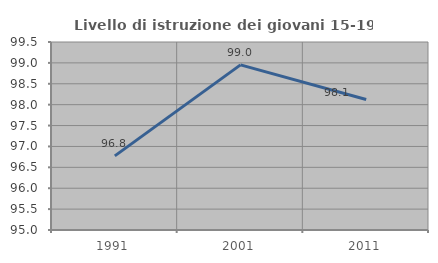
| Category | Livello di istruzione dei giovani 15-19 anni |
|---|---|
| 1991.0 | 96.774 |
| 2001.0 | 98.953 |
| 2011.0 | 98.122 |